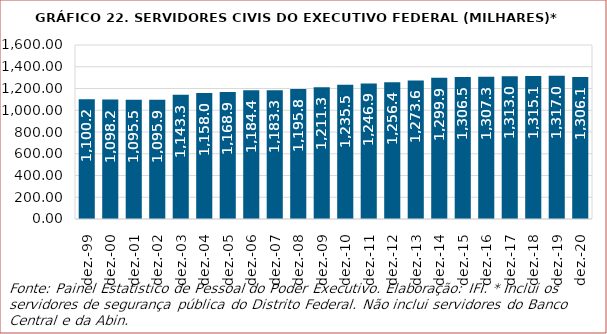
| Category | Series 0 |
|---|---|
| 1999-12-01 | 1100186 |
| 2000-12-01 | 1098231 |
| 2001-12-01 | 1095485 |
| 2002-12-01 | 1095885 |
| 2003-12-01 | 1143272 |
| 2004-12-01 | 1158004 |
| 2005-12-01 | 1168900 |
| 2006-12-01 | 1184361 |
| 2007-12-01 | 1183274 |
| 2008-12-01 | 1195777 |
| 2009-12-01 | 1211264 |
| 2010-12-01 | 1235483 |
| 2011-12-01 | 1246928 |
| 2012-12-01 | 1256350 |
| 2013-12-01 | 1273609 |
| 2014-12-01 | 1299895 |
| 2015-12-01 | 1306472 |
| 2016-12-01 | 1307345 |
| 2017-12-01 | 1312968 |
| 2018-12-01 | 1315115 |
| 2019-12-01 | 1317035 |
| 2020-12-01 | 1306109 |